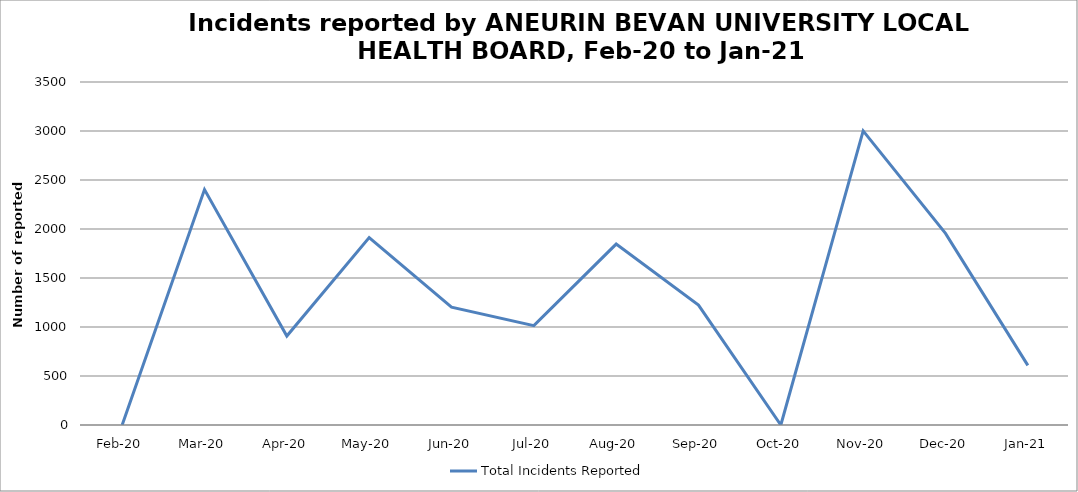
| Category | Total Incidents Reported |
|---|---|
| Feb-20 | 0 |
| Mar-20 | 2402 |
| Apr-20 | 908 |
| May-20 | 1913 |
| Jun-20 | 1202 |
| Jul-20 | 1014 |
| Aug-20 | 1846 |
| Sep-20 | 1224 |
| Oct-20 | 0 |
| Nov-20 | 3001 |
| Dec-20 | 1955 |
| Jan-21 | 608 |